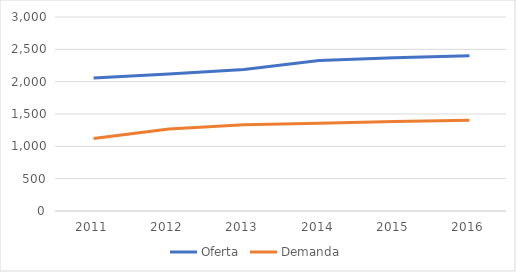
| Category | Oferta | Demanda |
|---|---|---|
| 2011.0 | 2055 | 1121 |
| 2012.0 | 2120 | 1268 |
| 2013.0 | 2187 | 1332 |
| 2014.0 | 2326 | 1357 |
| 2015.0 | 2370 | 1385 |
| 2016.0 | 2400 | 1402 |